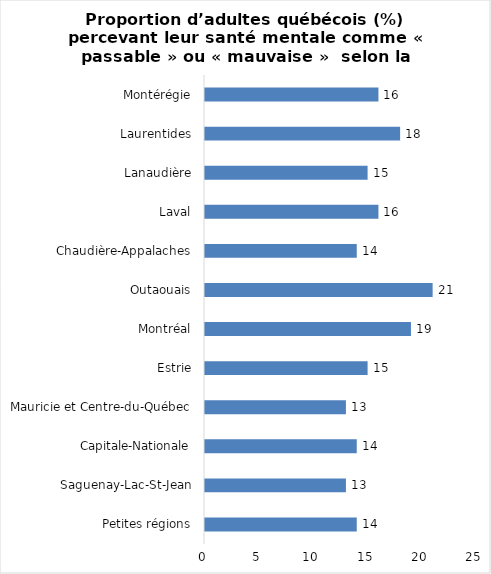
| Category | Series 0 |
|---|---|
| Petites régions | 14 |
| Saguenay-Lac-St-Jean | 13 |
| Capitale-Nationale | 14 |
| Mauricie et Centre-du-Québec | 13 |
| Estrie | 15 |
| Montréal | 19 |
| Outaouais | 21 |
| Chaudière-Appalaches | 14 |
| Laval | 16 |
| Lanaudière | 15 |
| Laurentides | 18 |
| Montérégie | 16 |